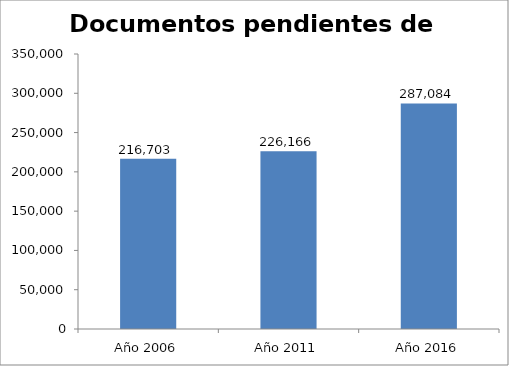
| Category | Documentos pendientes de catalogar |
|---|---|
| Año 2006 | 216703 |
| Año 2011 | 226166 |
| Año 2016 | 287084 |